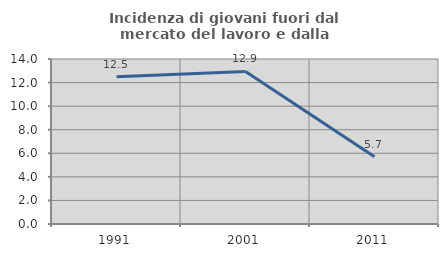
| Category | Incidenza di giovani fuori dal mercato del lavoro e dalla formazione  |
|---|---|
| 1991.0 | 12.5 |
| 2001.0 | 12.941 |
| 2011.0 | 5.714 |